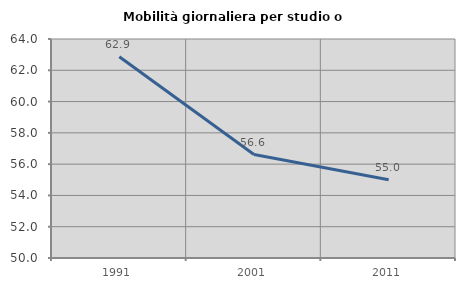
| Category | Mobilità giornaliera per studio o lavoro |
|---|---|
| 1991.0 | 62.863 |
| 2001.0 | 56.613 |
| 2011.0 | 55 |